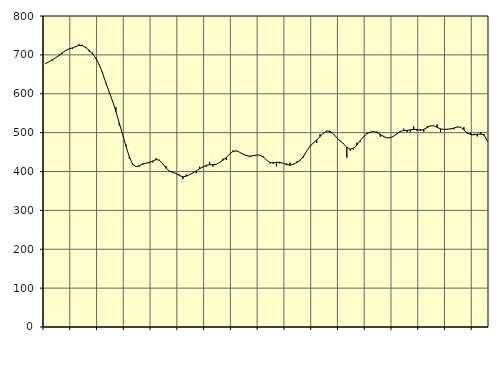
| Category | Piggar | Series 1 |
|---|---|---|
| nan | 676.5 | 678.28 |
| 87.0 | 682.6 | 682.55 |
| 87.0 | 684.5 | 687.34 |
| 87.0 | 693.2 | 692.38 |
| nan | 700 | 698.29 |
| 88.0 | 703.2 | 705.12 |
| 88.0 | 712.2 | 711.39 |
| 88.0 | 715.8 | 715.38 |
| nan | 715.1 | 718.01 |
| 89.0 | 720.4 | 721.36 |
| 89.0 | 727.2 | 724.63 |
| 89.0 | 726.1 | 723.93 |
| nan | 720.7 | 718.84 |
| 90.0 | 708.6 | 711.55 |
| 90.0 | 705.8 | 702.76 |
| 90.0 | 689.7 | 691.4 |
| nan | 674.4 | 674.96 |
| 91.0 | 656.5 | 652.93 |
| 91.0 | 626.8 | 627.99 |
| 91.0 | 602.9 | 604.09 |
| nan | 581.6 | 580.92 |
| 92.0 | 565.1 | 554.32 |
| 92.0 | 518.2 | 524.76 |
| 92.0 | 495.4 | 494.89 |
| nan | 469.2 | 464.93 |
| 93.0 | 433.4 | 437.69 |
| 93.0 | 417 | 418.87 |
| 93.0 | 413.9 | 412.54 |
| nan | 412.8 | 414.64 |
| 94.0 | 421 | 418.78 |
| 94.0 | 422.1 | 421.48 |
| 94.0 | 421.3 | 423.17 |
| nan | 423.4 | 426.89 |
| 95.0 | 434 | 430.69 |
| 95.0 | 430.2 | 428.92 |
| 95.0 | 419.7 | 419.66 |
| nan | 413.2 | 408.42 |
| 96.0 | 399.6 | 401.2 |
| 96.0 | 399.1 | 397.86 |
| 96.0 | 395.3 | 394.38 |
| nan | 391.8 | 389.39 |
| 97.0 | 380.1 | 386.26 |
| 97.0 | 392.3 | 387.85 |
| 97.0 | 391.9 | 391.85 |
| nan | 396.7 | 396.26 |
| 98.0 | 395.6 | 401.49 |
| 98.0 | 412 | 407.04 |
| 98.0 | 410.9 | 411.87 |
| nan | 412.5 | 415.94 |
| 99.0 | 425 | 417.44 |
| 99.0 | 412.8 | 417.34 |
| 99.0 | 418.3 | 418.71 |
| nan | 423.7 | 423.25 |
| 0.0 | 433.1 | 429.2 |
| 0.0 | 429.7 | 435.94 |
| 0.0 | 445.4 | 444.9 |
| nan | 453.8 | 451.82 |
| 1.0 | 454.3 | 452.9 |
| 1.0 | 449.3 | 449.28 |
| 1.0 | 445.2 | 444.47 |
| nan | 442.4 | 440.71 |
| 2.0 | 436.8 | 439.48 |
| 2.0 | 442 | 440.57 |
| 2.0 | 442.7 | 442.35 |
| nan | 441 | 441.94 |
| 3.0 | 439.3 | 437.41 |
| 3.0 | 429.6 | 429.63 |
| 3.0 | 420.5 | 423.29 |
| nan | 420 | 422.21 |
| 4.0 | 413.2 | 423.62 |
| 4.0 | 420.7 | 423.6 |
| 4.0 | 421.7 | 421.1 |
| nan | 421.1 | 417.67 |
| 5.0 | 422.7 | 416.27 |
| 5.0 | 419.3 | 418.42 |
| 5.0 | 425.4 | 422.7 |
| nan | 427.7 | 428.56 |
| 6.0 | 435.7 | 438.34 |
| 6.0 | 452.7 | 452.38 |
| 6.0 | 466.3 | 465.09 |
| nan | 472.8 | 473.36 |
| 7.0 | 474.1 | 480.87 |
| 7.0 | 496.2 | 489.81 |
| 7.0 | 498 | 498.53 |
| nan | 504.5 | 503.89 |
| 8.0 | 499 | 503.53 |
| 8.0 | 496.9 | 496.95 |
| 8.0 | 486.1 | 486.93 |
| nan | 477.3 | 478.76 |
| 9.0 | 472.4 | 471.25 |
| 9.0 | 435.9 | 462.7 |
| 9.0 | 453.7 | 457.27 |
| nan | 456.8 | 459.71 |
| 10.0 | 474 | 468.36 |
| 10.0 | 476.4 | 479.08 |
| 10.0 | 488.7 | 489.11 |
| nan | 499.6 | 496.95 |
| 11.0 | 500 | 501.43 |
| 11.0 | 502.9 | 502.51 |
| 11.0 | 502.8 | 500.72 |
| nan | 489.4 | 495.68 |
| 12.0 | 491.8 | 489.84 |
| 12.0 | 486.4 | 486.56 |
| 12.0 | 486.3 | 487.07 |
| nan | 490.7 | 490.83 |
| 13.0 | 496.3 | 497.35 |
| 13.0 | 502 | 503.26 |
| 13.0 | 510.1 | 505.28 |
| nan | 501.4 | 505.94 |
| 14.0 | 502 | 507.22 |
| 14.0 | 515.7 | 508.57 |
| 14.0 | 504.6 | 507.77 |
| nan | 509.3 | 506.18 |
| 15.0 | 502.4 | 508.3 |
| 15.0 | 516.4 | 512.97 |
| 15.0 | 518 | 517.18 |
| nan | 517.6 | 517.68 |
| 16.0 | 520.9 | 513.6 |
| 16.0 | 500.6 | 509.69 |
| 16.0 | 507.3 | 508.29 |
| nan | 509.6 | 508.7 |
| 17.0 | 508.7 | 509.8 |
| 17.0 | 508.6 | 511.69 |
| 17.0 | 513.9 | 514.66 |
| nan | 513.1 | 514.01 |
| 18.0 | 514 | 507.19 |
| 18.0 | 497.1 | 499.37 |
| 18.0 | 499.7 | 494.72 |
| nan | 496.7 | 494.4 |
| 19.0 | 490 | 496 |
| 19.0 | 501.4 | 496.12 |
| 19.0 | 492.3 | 494.77 |
| nan | 477.8 | 478.14 |